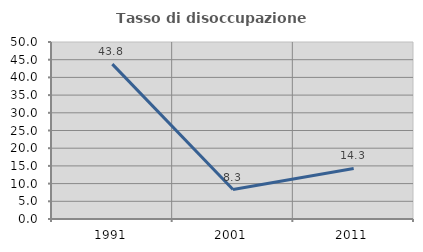
| Category | Tasso di disoccupazione giovanile  |
|---|---|
| 1991.0 | 43.75 |
| 2001.0 | 8.333 |
| 2011.0 | 14.286 |